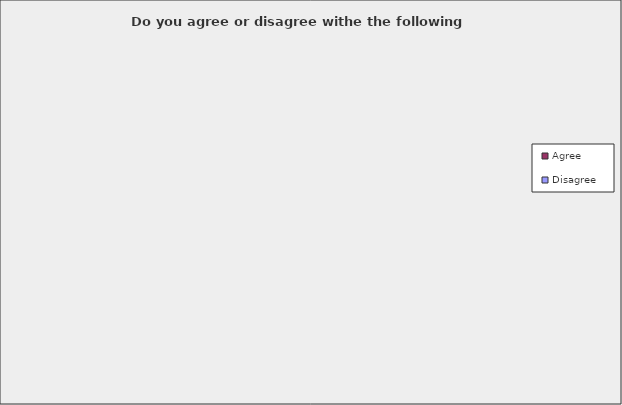
| Category | Disagree | Agree |
|---|---|---|
| Increases charges for letting out council buildings (£50,000) | 180 | 612 |
| Introducing charges for community bedding plants (£145,000) | 298 | 480 |
| Raise charges for out of school care clubs (up to £2.50 per session) | 330 | 457 |
| Traffic calming and speed reduction measures to be paid for by re-implementing car parking charges across Aberdeenshire (£250,000) | 381 | 404 |
| Transferring funding from roads budget to increase investment in walking and cycling (£50,000) | 516 | 271 |
| Investing in renewable energy and solar panels which could generate (£50,000) | 141 | 647 |
| Revisiting the charging structure for sport and physical activity from 2017 (£650,000) | 270 | 514 |
| An increase to burial charges (£350,000) | 445 | 342 |